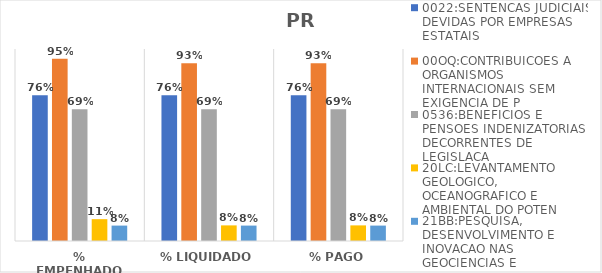
| Category | 0022:SENTENCAS JUDICIAIS DEVIDAS POR EMPRESAS ESTATAIS | 00OQ:CONTRIBUICOES A ORGANISMOS INTERNACIONAIS SEM EXIGENCIA DE P | 0536:BENEFICIOS E PENSOES INDENIZATORIAS DECORRENTES DE LEGISLACA | 20LC:LEVANTAMENTO GEOLOGICO, OCEANOGRAFICO E AMBIENTAL DO POTEN | 21BB:PESQUISA, DESENVOLVIMENTO E INOVACAO NAS GEOCIENCIAS E |
|---|---|---|---|---|---|
| % EMPENHADO | 0.759 | 0.95 | 0.687 | 0.114 | 0.08 |
| % LIQUIDADO | 0.759 | 0.926 | 0.687 | 0.081 | 0.08 |
| % PAGO | 0.759 | 0.926 | 0.687 | 0.081 | 0.08 |